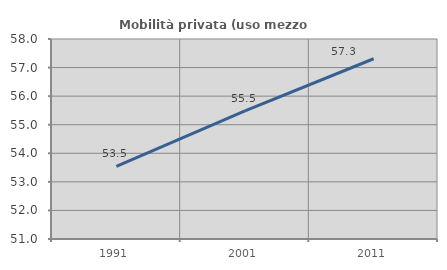
| Category | Mobilità privata (uso mezzo privato) |
|---|---|
| 1991.0 | 53.541 |
| 2001.0 | 55.481 |
| 2011.0 | 57.309 |